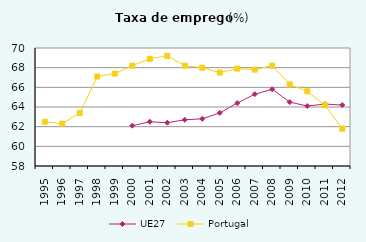
| Category | UE27 | Portugal |
|---|---|---|
| 1995.0 | 0 | 62.5 |
| 1996.0 | 0 | 62.3 |
| 1997.0 | 0 | 63.4 |
| 1998.0 | 0 | 67.1 |
| 1999.0 | 0 | 67.4 |
| 2000.0 | 62.1 | 68.2 |
| 2001.0 | 62.5 | 68.9 |
| 2002.0 | 62.4 | 69.2 |
| 2003.0 | 62.7 | 68.2 |
| 2004.0 | 62.8 | 68 |
| 2005.0 | 63.4 | 67.5 |
| 2006.0 | 64.4 | 67.9 |
| 2007.0 | 65.3 | 67.8 |
| 2008.0 | 65.8 | 68.2 |
| 2009.0 | 64.5 | 66.3 |
| 2010.0 | 64.1 | 65.6 |
| 2011.0 | 64.3 | 64.2 |
| 2012.0 | 64.2 | 61.8 |